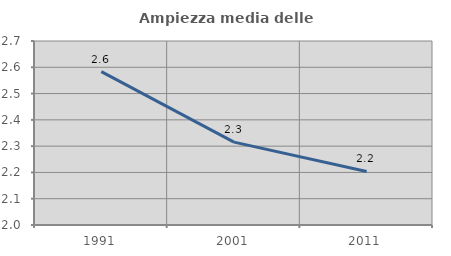
| Category | Ampiezza media delle famiglie |
|---|---|
| 1991.0 | 2.583 |
| 2001.0 | 2.315 |
| 2011.0 | 2.204 |